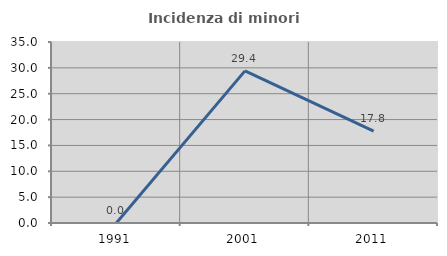
| Category | Incidenza di minori stranieri |
|---|---|
| 1991.0 | 0 |
| 2001.0 | 29.412 |
| 2011.0 | 17.757 |